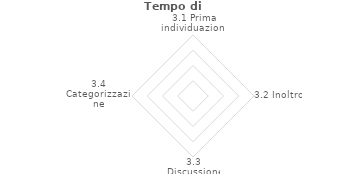
| Category | Series 2 |
|---|---|
| 3.1 Prima individuazione | 0 |
| 3.2 Inoltro | 0 |
| 3.3 Discussione | 0 |
| 3.4 Categorizzazione | 0 |